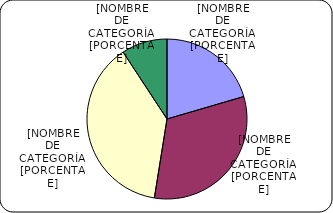
| Category | Series 0 |
|---|---|
| Entre 1-5 años | 2528.8 |
| Entre 6-10 años | 3961.2 |
| Entre 11-20 años | 4723.8 |
| Mayores de 20 años | 1141.8 |